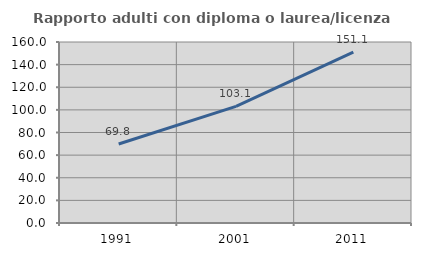
| Category | Rapporto adulti con diploma o laurea/licenza media  |
|---|---|
| 1991.0 | 69.841 |
| 2001.0 | 103.11 |
| 2011.0 | 151.126 |